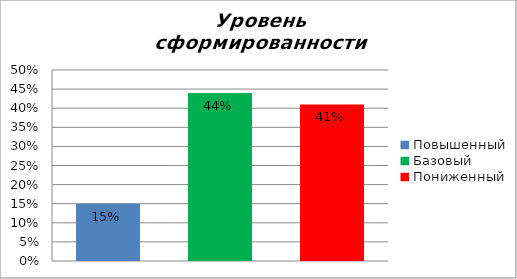
| Category | Уровень сформированности предметных результатов |
|---|---|
| Повышенный | 0.15 |
| Базовый | 0.44 |
| Пониженный | 0.41 |